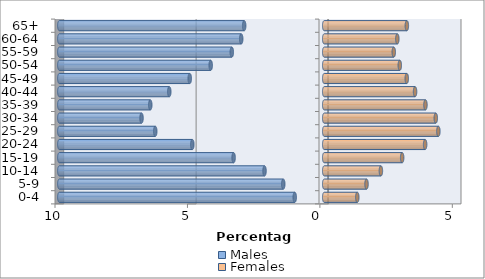
| Category | Males | Females |
|---|---|---|
| 0-4 | -1.113 | 1.249 |
| 5-9 | -1.547 | 1.597 |
| 10-14 | -2.254 | 2.14 |
| 15-19 | -3.421 | 2.943 |
| 20-24 | -4.98 | 3.81 |
| 25-29 | -6.379 | 4.31 |
| 30-34 | -6.897 | 4.212 |
| 35-39 | -6.567 | 3.822 |
| 40-44 | -5.849 | 3.43 |
| 45-49 | -5.077 | 3.116 |
| 50-54 | -4.286 | 2.853 |
| 55-59 | -3.489 | 2.626 |
| 60-64 | -3.134 | 2.76 |
| 65+ | -3.022 | 3.119 |